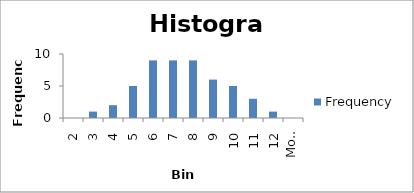
| Category | Frequency |
|---|---|
| 2 | 0 |
| 3 | 1 |
| 4 | 2 |
| 5 | 5 |
| 6 | 9 |
| 7 | 9 |
| 8 | 9 |
| 9 | 6 |
| 10 | 5 |
| 11 | 3 |
| 12 | 1 |
| More | 0 |